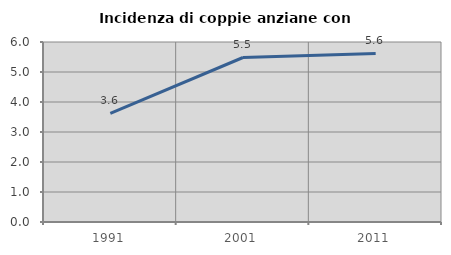
| Category | Incidenza di coppie anziane con figli |
|---|---|
| 1991.0 | 3.617 |
| 2001.0 | 5.484 |
| 2011.0 | 5.618 |